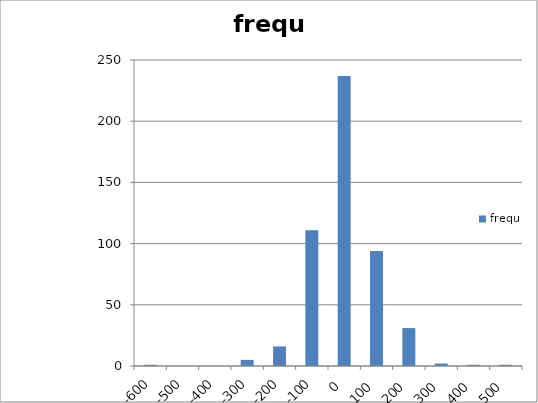
| Category | frequ |
|---|---|
| -600.0 | 1 |
| -500.0 | 0 |
| -400.0 | 0 |
| -300.0 | 5 |
| -200.0 | 16 |
| -100.0 | 111 |
| 0.0 | 237 |
| 100.0 | 94 |
| 200.0 | 31 |
| 300.0 | 2 |
| 400.0 | 1 |
| 500.0 | 1 |